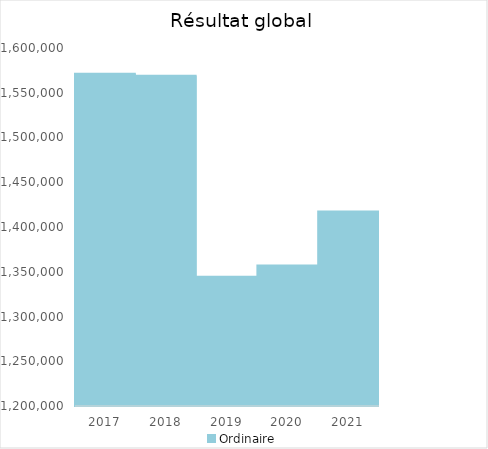
| Category |   | Ordinaire |    |
|---|---|---|---|
| 2017.0 |  | 1571105.1 |  |
| 2018.0 |  | 1568921.87 |  |
| 2019.0 |  | 1344322.22 |  |
| 2020.0 |  | 1357068.51 |  |
| 2021.0 |  | 1417335.08 |  |